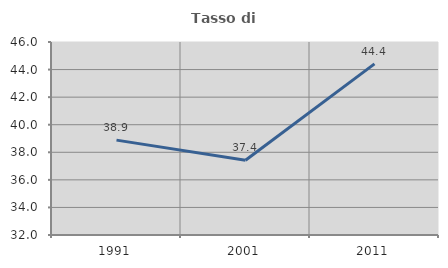
| Category | Tasso di occupazione   |
|---|---|
| 1991.0 | 38.882 |
| 2001.0 | 37.421 |
| 2011.0 | 44.414 |